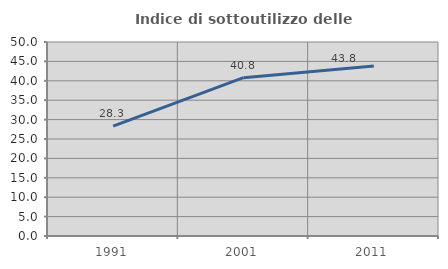
| Category | Indice di sottoutilizzo delle abitazioni  |
|---|---|
| 1991.0 | 28.306 |
| 2001.0 | 40.803 |
| 2011.0 | 43.837 |